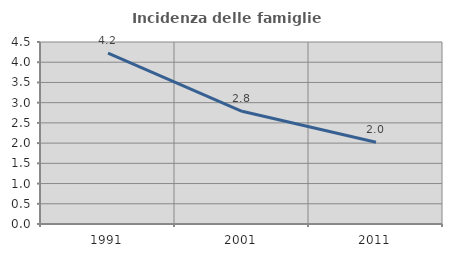
| Category | Incidenza delle famiglie numerose |
|---|---|
| 1991.0 | 4.222 |
| 2001.0 | 2.787 |
| 2011.0 | 2.023 |